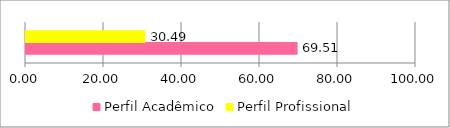
| Category | Perfil Acadêmico | Perfil Profissional |
|---|---|---|
| 0 | 69.512 | 30.488 |